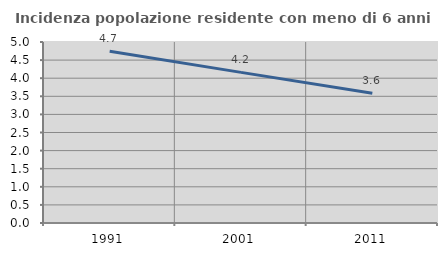
| Category | Incidenza popolazione residente con meno di 6 anni |
|---|---|
| 1991.0 | 4.747 |
| 2001.0 | 4.16 |
| 2011.0 | 3.583 |